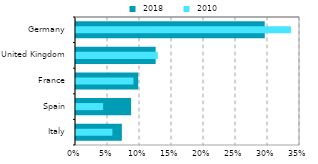
| Category |  2018 |
|---|---|
| Italy | 0.072 |
| Spain | 0.086 |
| France | 0.097 |
| United Kingdom | 0.124 |
| Germany | 0.295 |